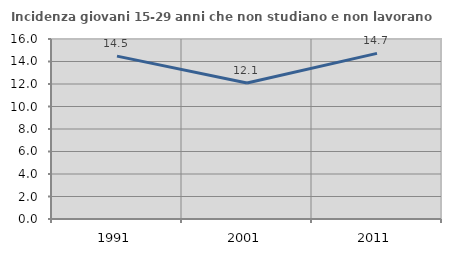
| Category | Incidenza giovani 15-29 anni che non studiano e non lavorano  |
|---|---|
| 1991.0 | 14.477 |
| 2001.0 | 12.082 |
| 2011.0 | 14.72 |